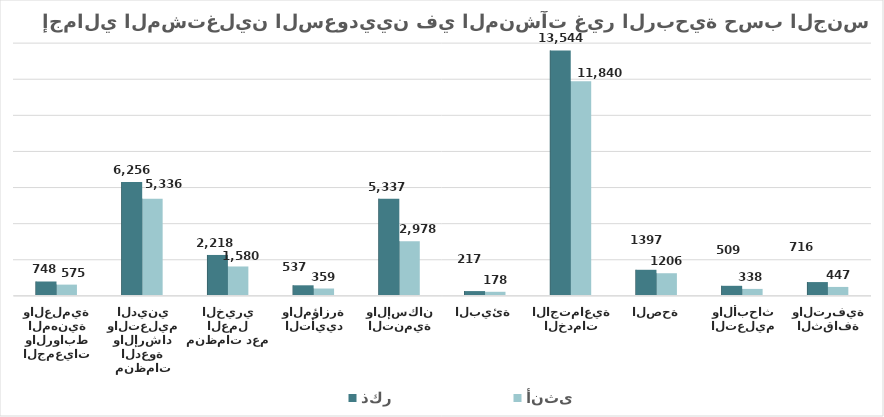
| Category | ذكر | أنثى |
|---|---|---|
| الثقافة والترفية | 716 | 447 |
| التعليم والأبحاث | 509 | 338 |
| الصحة | 1397 | 1206 |
| الخدمات الاجتماعية | 13544 | 11840 |
| البيئة | 217 | 178 |
| التنمية والإسكان | 5337 | 2978 |
| التأييد والمؤازرة | 537 | 359 |
| منظمات دعم العمل الخيري | 2218 | 1580 |
| منظمات الدعوة والإرشاد والتعليم الديني | 6256 | 5336 |
| الجمعيات والروابط المهنية والعلمية | 748 | 575 |